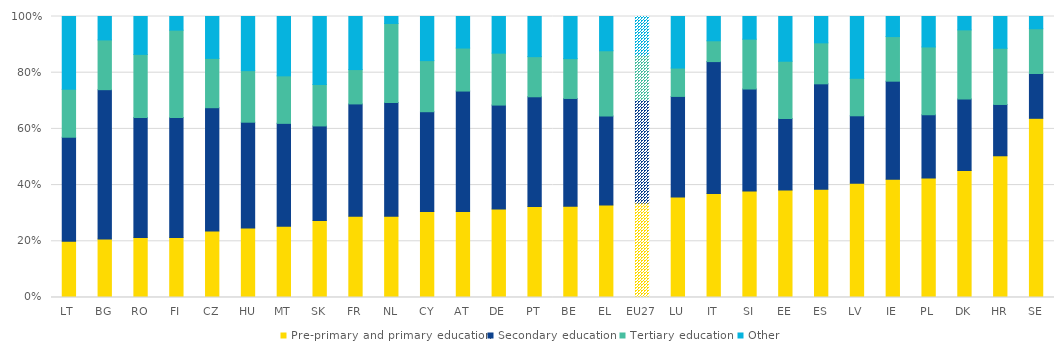
| Category | Pre-primary and primary education | Secondary education | Tertiary education | Other |
|---|---|---|---|---|
| LT | 0.2 | 0.37 | 0.17 | 0.259 |
| BG | 0.208 | 0.531 | 0.177 | 0.083 |
| RO | 0.213 | 0.427 | 0.225 | 0.135 |
| FI | 0.214 | 0.427 | 0.311 | 0.049 |
| CZ | 0.237 | 0.439 | 0.175 | 0.149 |
| HU | 0.248 | 0.376 | 0.183 | 0.193 |
| MT | 0.254 | 0.366 | 0.169 | 0.211 |
| SK | 0.274 | 0.337 | 0.147 | 0.242 |
| FR | 0.289 | 0.4 | 0.122 | 0.189 |
| NL | 0.289 | 0.405 | 0.281 | 0.025 |
| CY | 0.306 | 0.355 | 0.182 | 0.157 |
| AT | 0.306 | 0.429 | 0.153 | 0.112 |
| DE | 0.315 | 0.37 | 0.185 | 0.13 |
| PT | 0.324 | 0.39 | 0.143 | 0.143 |
| BE | 0.325 | 0.383 | 0.142 | 0.15 |
| EL | 0.329 | 0.317 | 0.232 | 0.122 |
| EU27 | 0.337 | 0.366 | 0.158 | 0.139 |
| LU | 0.358 | 0.358 | 0.101 | 0.183 |
| IT | 0.37 | 0.469 | 0.074 | 0.086 |
| SI | 0.379 | 0.363 | 0.177 | 0.081 |
| EE | 0.382 | 0.255 | 0.204 | 0.159 |
| ES | 0.385 | 0.375 | 0.146 | 0.094 |
| LV | 0.407 | 0.24 | 0.133 | 0.22 |
| IE | 0.421 | 0.349 | 0.159 | 0.071 |
| PL | 0.425 | 0.225 | 0.242 | 0.108 |
| DK | 0.452 | 0.254 | 0.246 | 0.048 |
| HR | 0.504 | 0.183 | 0.2 | 0.113 |
| SE | 0.638 | 0.159 | 0.159 | 0.043 |